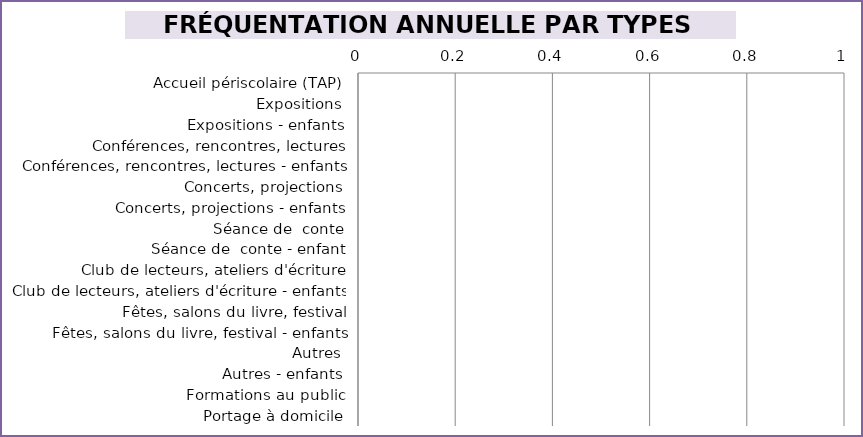
| Category | Series 0 |
|---|---|
| Accueil périscolaire (TAP) | 0 |
| Expositions | 0 |
| Expositions - enfants | 0 |
| Conférences, rencontres, lectures | 0 |
| Conférences, rencontres, lectures - enfants | 0 |
| Concerts, projections | 0 |
| Concerts, projections - enfants | 0 |
| Séance de  conte | 0 |
| Séance de  conte - enfant | 0 |
| Club de lecteurs, ateliers d'écriture | 0 |
| Club de lecteurs, ateliers d'écriture - enfants | 0 |
| Fêtes, salons du livre, festival | 0 |
| Fêtes, salons du livre, festival - enfants | 0 |
| Autres | 0 |
| Autres - enfants | 0 |
| Formations au public | 0 |
| Portage à domicile | 0 |